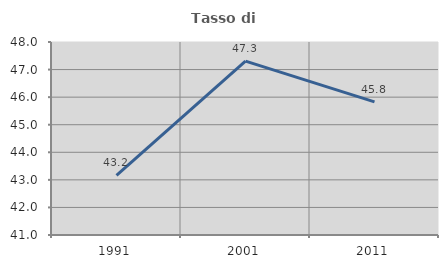
| Category | Tasso di occupazione   |
|---|---|
| 1991.0 | 43.161 |
| 2001.0 | 47.306 |
| 2011.0 | 45.827 |